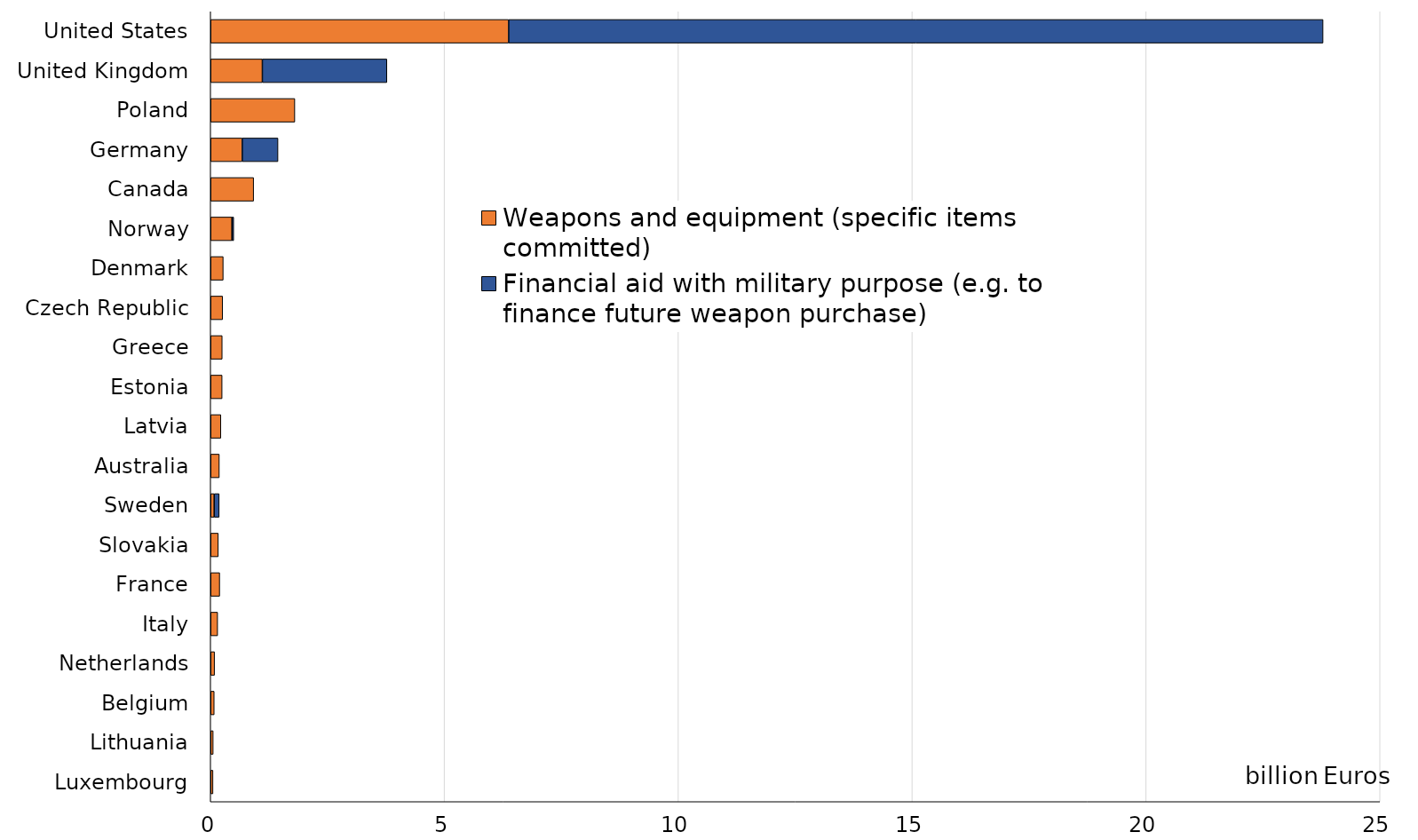
| Category | Weapons and equipment (specific items committed) | Financial aid with military purpose (e.g. to finance future weapon purchase) |
|---|---|---|
| United States | 6.371 | 17.411 |
| United Kingdom | 1.105 | 2.663 |
| Poland | 1.8 | 0 |
| Germany | 0.675 | 0.764 |
| Canada | 0.919 | 0 |
| Norway | 0.455 | 0.039 |
| Denmark | 0.269 | 0 |
| Czech Republic | 0.256 | 0 |
| Greece | 0.247 | 0 |
| Estonia | 0.245 | 0 |
| Latvia | 0.219 | 0 |
| Australia | 0.185 | 0 |
| Sweden | 0.075 | 0.107 |
| Slovakia | 0.164 | 0 |
| France | 0.194 | 0 |
| Italy | 0.15 | 0 |
| Netherlands | 0.084 | 0 |
| Belgium | 0.076 | 0 |
| Lithuania | 0.054 | 0 |
| Luxembourg | 0.05 | 0 |